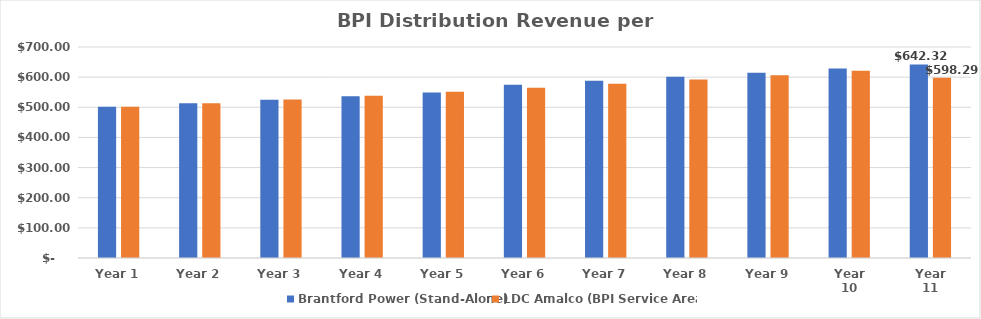
| Category | Brantford Power (Stand-Alone) | LDC Amalco (BPI Service Area) |
|---|---|---|
| Year 1 | 502.072 | 502.072 |
| Year 2 | 513.345 | 513.345 |
| Year 3 | 524.88 | 525.652 |
| Year 4 | 536.695 | 538.276 |
| Year 5 | 548.796 | 551.223 |
| Year 6 | 575.028 | 564.504 |
| Year 7 | 588.008 | 578.127 |
| Year 8 | 601.311 | 592.102 |
| Year 9 | 614.938 | 606.439 |
| Year 10 | 628.899 | 621.147 |
| Year 11 | 642.32 | 598.289 |